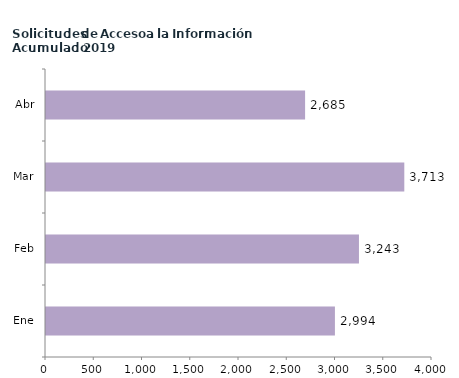
| Category | Series 0 |
|---|---|
| Ene | 2994 |
| Feb | 3243 |
| Mar | 3713 |
| Abr | 2685 |